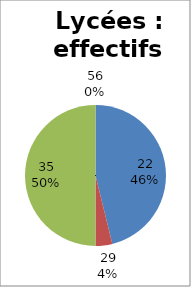
| Category | Lycées |
|---|---|
| 22.0 | 12 |
| 29.0 | 1 |
| 35.0 | 13 |
| 56.0 | 0 |